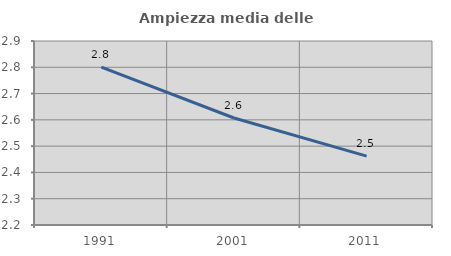
| Category | Ampiezza media delle famiglie |
|---|---|
| 1991.0 | 2.801 |
| 2001.0 | 2.607 |
| 2011.0 | 2.462 |